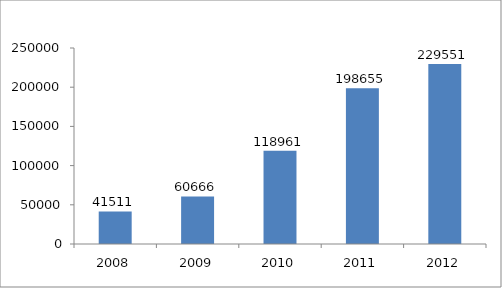
| Category | Series 0 |
|---|---|
| 2008 | 41511 |
| 2009 | 60666 |
| 2010 | 118961 |
| 2011 | 198655 |
| 2012 | 229551 |